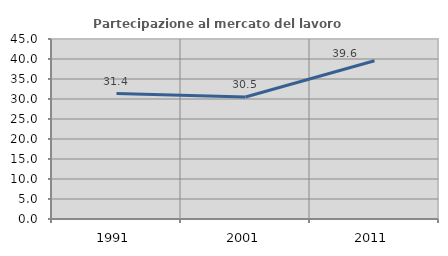
| Category | Partecipazione al mercato del lavoro  femminile |
|---|---|
| 1991.0 | 31.353 |
| 2001.0 | 30.495 |
| 2011.0 | 39.559 |